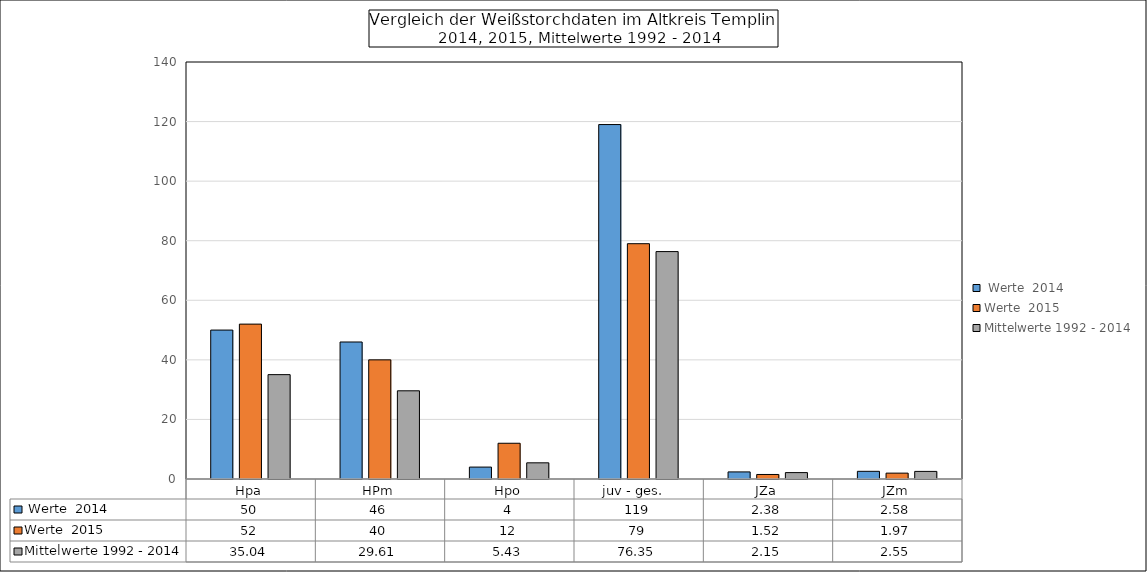
| Category |  Werte  2014 | Werte  2015 | Mittelwerte 1992 - 2014 |
|---|---|---|---|
| Hpa | 50 | 52 | 35.04 |
| HPm | 46 | 40 | 29.61 |
| Hpo | 4 | 12 | 5.43 |
| juv - ges.   | 119 | 79 | 76.35 |
| JZa | 2.38 | 1.52 | 2.15 |
| JZm | 2.58 | 1.97 | 2.55 |